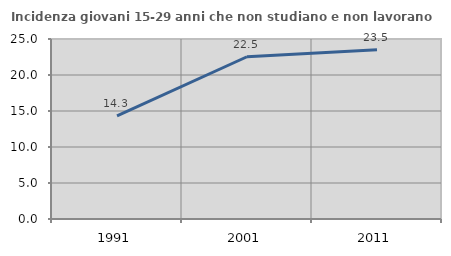
| Category | Incidenza giovani 15-29 anni che non studiano e non lavorano  |
|---|---|
| 1991.0 | 14.313 |
| 2001.0 | 22.535 |
| 2011.0 | 23.497 |